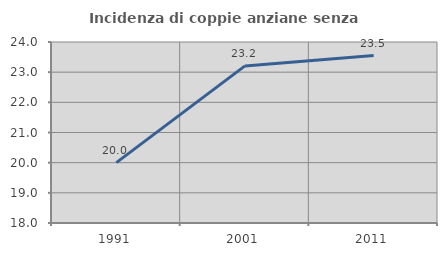
| Category | Incidenza di coppie anziane senza figli  |
|---|---|
| 1991.0 | 20 |
| 2001.0 | 23.207 |
| 2011.0 | 23.549 |